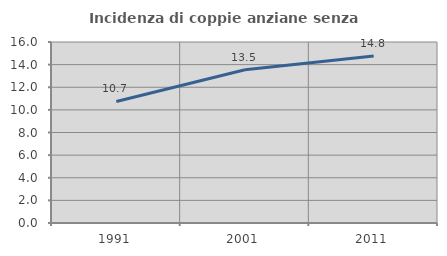
| Category | Incidenza di coppie anziane senza figli  |
|---|---|
| 1991.0 | 10.747 |
| 2001.0 | 13.542 |
| 2011.0 | 14.772 |